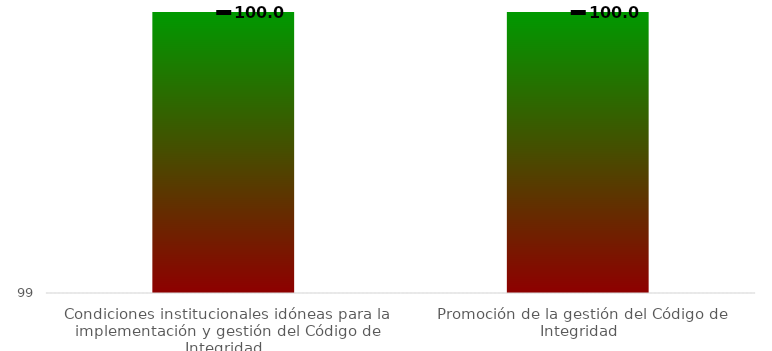
| Category | Rangos |
|---|---|
| Condiciones institucionales idóneas para la implementación y gestión del Código de Integridad | 100 |
| Promoción de la gestión del Código de Integridad | 100 |